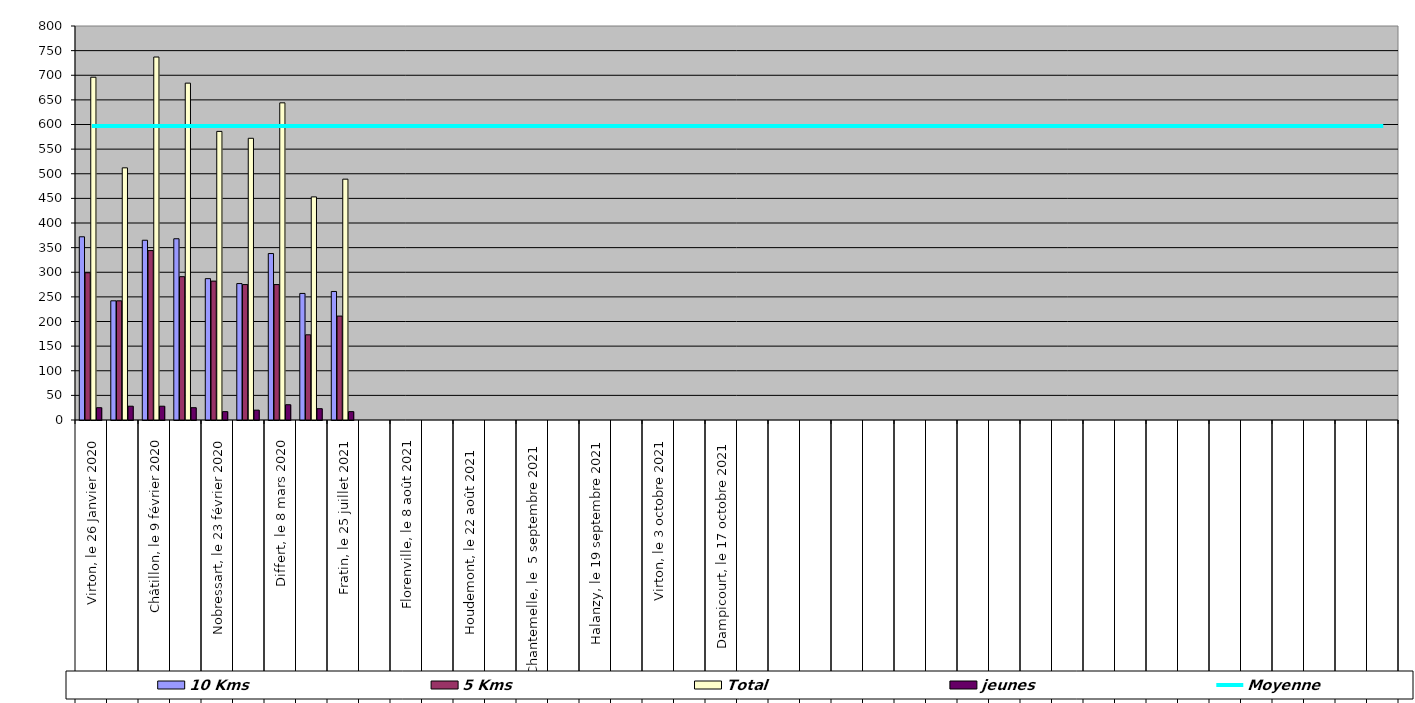
| Category | 10 Kms | 5 Kms | Total | jeunes |
|---|---|---|---|---|
| 0 | 372 | 299 | 696 | 25 |
| 1 | 242 | 242 | 512 | 28 |
| 2 | 365 | 344 | 737 | 28 |
| 3 | 368 | 291 | 684 | 25 |
| 4 | 287 | 282 | 586 | 17 |
| 5 | 277 | 275 | 572 | 20 |
| 6 | 338 | 275 | 644 | 31 |
| 7 | 257 | 173 | 453 | 23 |
| 8 | 261 | 211 | 489 | 17 |
| 9 | 0 | 0 | 0 | 0 |
| 10 | 0 | 0 | 0 | 0 |
| 11 | 0 | 0 | 0 | 0 |
| 12 | 0 | 0 | 0 | 0 |
| 13 | 0 | 0 | 0 | 0 |
| 14 | 0 | 0 | 0 | 0 |
| 15 | 0 | 0 | 0 | 0 |
| 16 | 0 | 0 | 0 | 0 |
| 17 | 0 | 0 | 0 | 0 |
| 18 | 0 | 0 | 0 | 0 |
| 19 | 0 | 0 | 0 | 0 |
| 20 | 0 | 0 | 0 | 0 |
| 21 | 0 | 0 | 0 | 0 |
| 22 | 0 | 0 | 0 | 0 |
| 23 | 0 | 0 | 0 | 0 |
| 24 | 0 | 0 | 0 | 0 |
| 25 | 0 | 0 | 0 | 0 |
| 26 | 0 | 0 | 0 | 0 |
| 27 | 0 | 0 | 0 | 0 |
| 28 | 0 | 0 | 0 | 0 |
| 29 | 0 | 0 | 0 | 0 |
| 30 | 0 | 0 | 0 | 0 |
| 31 | 0 | 0 | 0 | 0 |
| 32 | 0 | 0 | 0 | 0 |
| 33 | 0 | 0 | 0 | 0 |
| 34 | 0 | 0 | 0 | 0 |
| 35 | 0 | 0 | 0 | 0 |
| 36 | 0 | 0 | 0 | 0 |
| 37 | 0 | 0 | 0 | 0 |
| 38 | 0 | 0 | 0 | 0 |
| 39 | 0 | 0 | 0 | 0 |
| 40 | 0 | 0 | 0 | 0 |
| 41 | 0 | 0 | 0 | 0 |